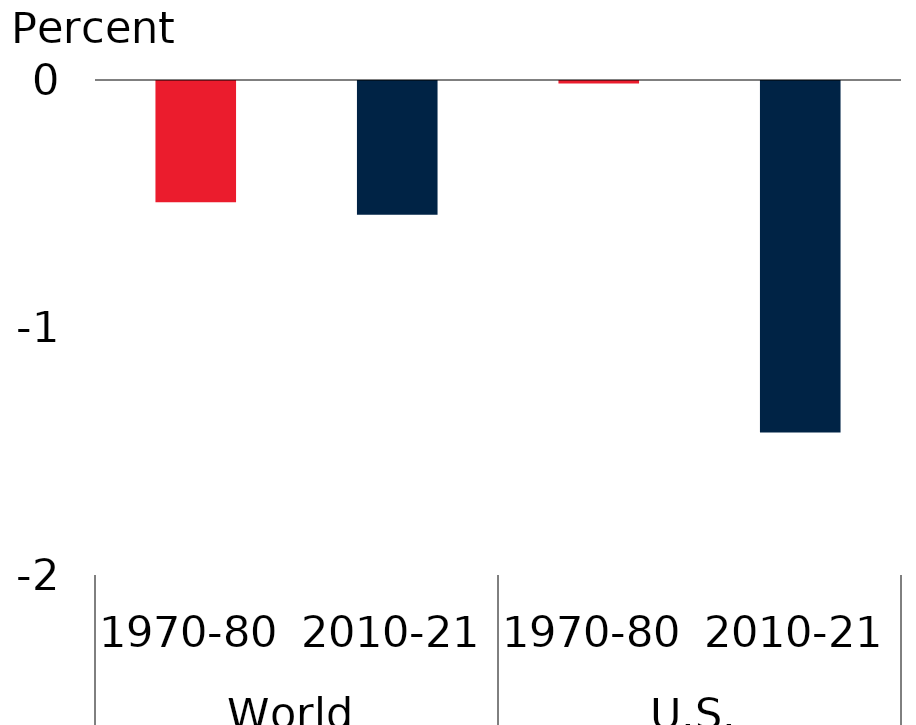
| Category | Three-year slowdown |
|---|---|
| 0 | -0.49 |
| 1 | -0.54 |
| 2 | -0.01 |
| 3 | -1.42 |